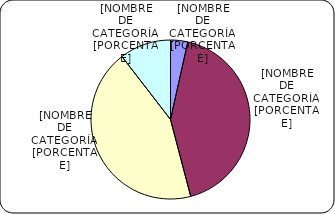
| Category | Series 0 |
|---|---|
| Menores de 3% | 428.8 |
| Entre 3% y 6% | 5207.9 |
| Entre 6% y 8% | 5357.1 |
| Entre 8% y 9% | 1284 |